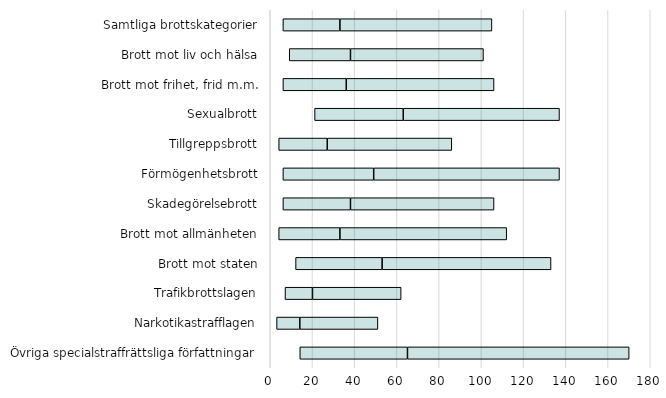
| Category | KV1 | KV2 | KV3 |
|---|---|---|---|
| Övriga specialstraffrättsliga författningar | 14 | 51 | 105 |
| Narkotikastrafflagen | 3 | 11 | 37 |
| Trafikbrottslagen | 7 | 13 | 42 |
| Brott mot staten | 12 | 41 | 80 |
| Brott mot allmänheten | 4 | 29 | 79 |
| Skadegörelsebrott | 6 | 32 | 68 |
| Förmögenhetsbrott | 6 | 43 | 88 |
| Tillgreppsbrott | 4 | 23 | 59 |
| Sexualbrott | 21 | 42 | 74 |
| Brott mot frihet, frid m.m. | 6 | 30 | 70 |
| Brott mot liv och hälsa | 9 | 29 | 63 |
| Samtliga brottskategorier | 6 | 27 | 72 |